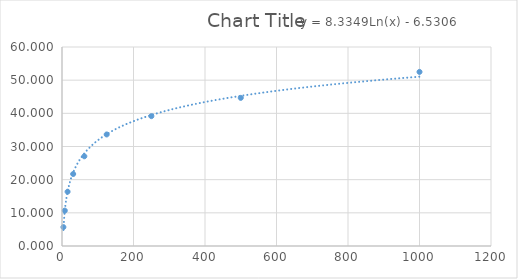
| Category | Series 0 |
|---|---|
| 3.91 | 5.694 |
| 7.81 | 10.676 |
| 15.62 | 16.37 |
| 31.25 | 21.708 |
| 62.5 | 27.046 |
| 125.0 | 33.63 |
| 250.0 | 39.146 |
| 500.0 | 44.662 |
| 1000.0 | 52.491 |